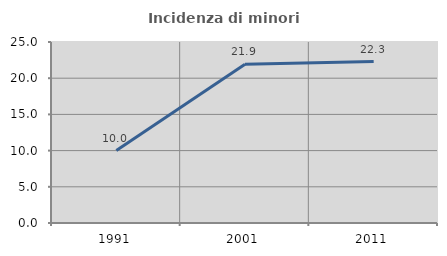
| Category | Incidenza di minori stranieri |
|---|---|
| 1991.0 | 10 |
| 2001.0 | 21.918 |
| 2011.0 | 22.296 |